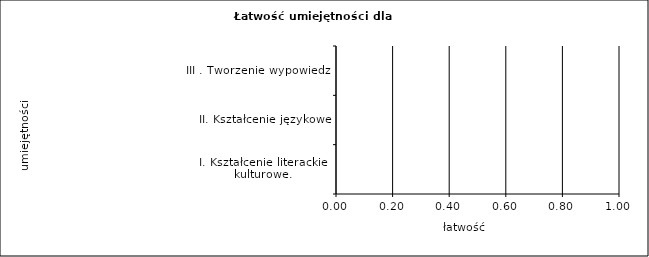
| Category | Łatwość według oddziałów |
|---|---|
| I. Kształcenie literackie i kulturowe.  | 0 |
| II. Kształcenie językowe | 0 |
| III . Tworzenie wypowiedzi | 0 |